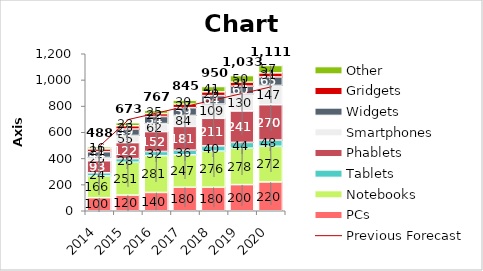
| Category | PCs | Notebooks | Tablets | Phablets | Smartphones | Widgets | Gridgets | Other |
|---|---|---|---|---|---|---|---|---|
| 2014.0 | 100 | 165.82 | 24.01 | 92.577 | 25.288 | 43.797 | 21.322 | 15.542 |
| 2015.0 | 120 | 250.649 | 28 | 122.175 | 54.764 | 48.88 | 25.102 | 23.445 |
| 2016.0 | 140 | 281.152 | 31.99 | 151.773 | 61.512 | 53.962 | 22.105 | 24.738 |
| 2017.0 | 180 | 247.405 | 35.979 | 181.371 | 83.857 | 59.045 | 27.441 | 30.372 |
| 2018.0 | 180 | 275.789 | 39.969 | 210.97 | 108.887 | 64.127 | 29.283 | 40.563 |
| 2019.0 | 200 | 278.416 | 43.958 | 240.568 | 129.598 | 59.62 | 31.179 | 49.842 |
| 2020.0 | 220 | 272.438 | 47.948 | 270.166 | 147.424 | 64.611 | 31.14 | 56.803 |